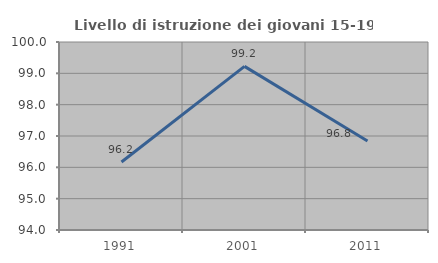
| Category | Livello di istruzione dei giovani 15-19 anni |
|---|---|
| 1991.0 | 96.172 |
| 2001.0 | 99.223 |
| 2011.0 | 96.842 |